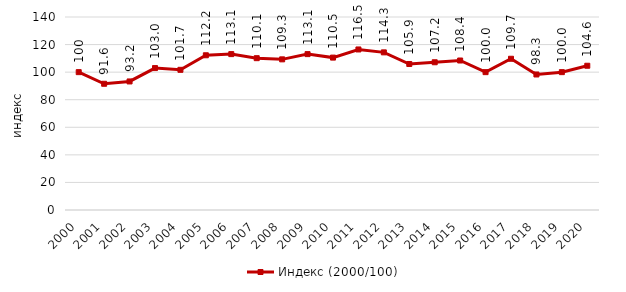
| Category | Индекс (2000/100) |
|---|---|
| 2000.0 | 100 |
| 2001.0 | 91.561 |
| 2002.0 | 93.249 |
| 2003.0 | 102.954 |
| 2004.0 | 101.688 |
| 2005.0 | 112.236 |
| 2006.0 | 113.08 |
| 2007.0 | 110.127 |
| 2008.0 | 109.283 |
| 2009.0 | 113.08 |
| 2010.0 | 110.549 |
| 2011.0 | 116.456 |
| 2012.0 | 114.346 |
| 2013.0 | 105.907 |
| 2014.0 | 107.173 |
| 2015.0 | 108.439 |
| 2016.0 | 100 |
| 2017.0 | 109.705 |
| 2018.0 | 98.312 |
| 2019.0 | 100 |
| 2020.0 | 104.641 |